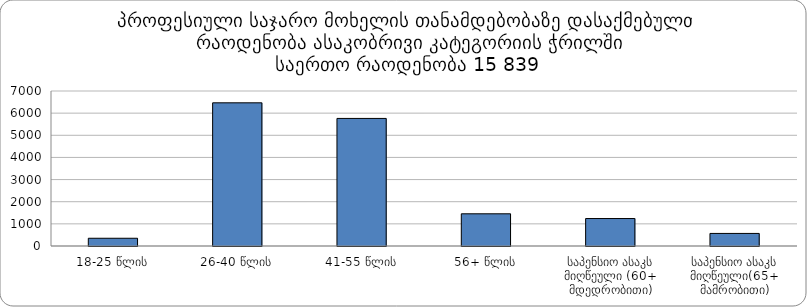
| Category | ჯამი |
|---|---|
| 18-25 წლის | 350 |
| 26-40 წლის | 6466 |
| 41-55 წლის | 5761 |
| 56+ წლის | 1454 |
| საპენსიო ასაკს მიღწეული (60+ მდედრობითი) | 1240 |
| საპენსიო ასაკს მიღწეული(65+ მამრობითი) | 568 |